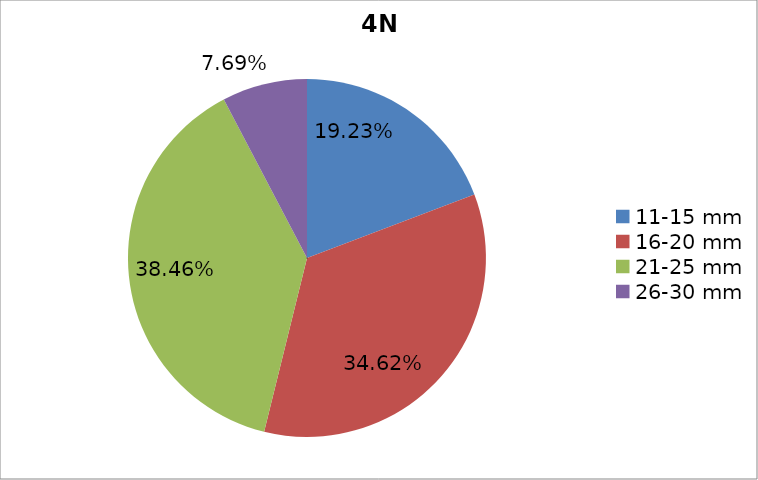
| Category | Series 0 |
|---|---|
| 11-15 mm | 0.192 |
| 16-20 mm | 0.346 |
| 21-25 mm | 0.385 |
| 26-30 mm | 0.077 |